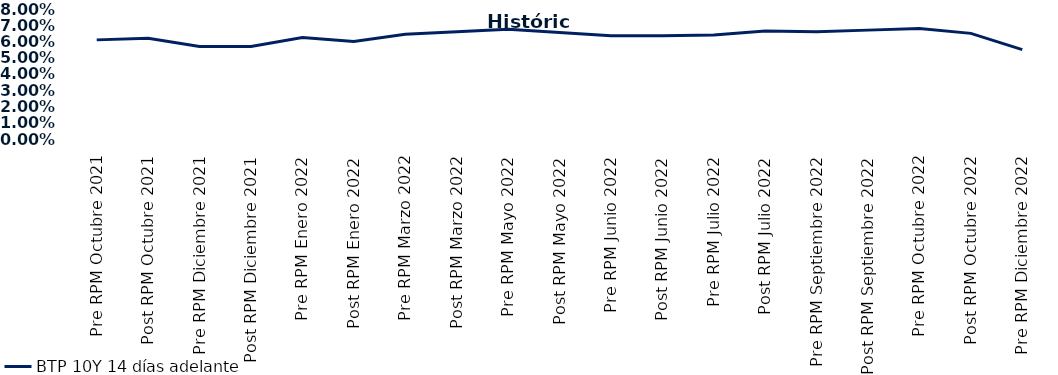
| Category | BTP 10Y 14 días adelante |
|---|---|
| Pre RPM Octubre 2021 | 0.061 |
| Post RPM Octubre 2021 | 0.062 |
| Pre RPM Diciembre 2021 | 0.057 |
| Post RPM Diciembre 2021 | 0.057 |
| Pre RPM Enero 2022 | 0.062 |
| Post RPM Enero 2022 | 0.06 |
| Pre RPM Marzo 2022 | 0.064 |
| Post RPM Marzo 2022 | 0.066 |
| Pre RPM Mayo 2022 | 0.068 |
| Post RPM Mayo 2022 | 0.066 |
| Pre RPM Junio 2022 | 0.064 |
| Post RPM Junio 2022 | 0.064 |
| Pre RPM Julio 2022 | 0.064 |
| Post RPM Julio 2022 | 0.066 |
| Pre RPM Septiembre 2022 | 0.066 |
| Post RPM Septiembre 2022 | 0.067 |
| Pre RPM Octubre 2022 | 0.068 |
| Post RPM Octubre 2022 | 0.065 |
| Pre RPM Diciembre 2022 | 0.055 |